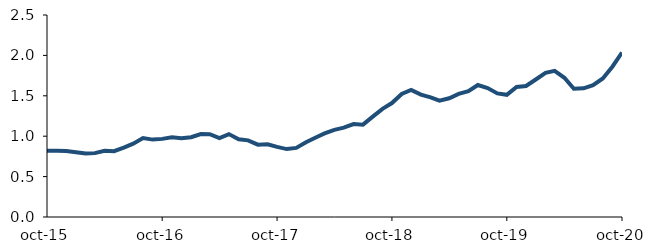
| Category | Series 0 |
|---|---|
| 2015-10-01 | 0.82 |
| 2015-11-01 | 0.821 |
| 2015-12-01 | 0.818 |
| 2016-01-01 | 0.803 |
| 2016-02-01 | 0.785 |
| 2016-03-01 | 0.79 |
| 2016-04-01 | 0.82 |
| 2016-05-01 | 0.815 |
| 2016-06-01 | 0.86 |
| 2016-07-01 | 0.907 |
| 2016-08-01 | 0.978 |
| 2016-09-01 | 0.958 |
| 2016-10-01 | 0.967 |
| 2016-11-01 | 0.986 |
| 2016-12-01 | 0.976 |
| 2017-01-01 | 0.988 |
| 2017-02-01 | 1.026 |
| 2017-03-01 | 1.025 |
| 2017-04-01 | 0.976 |
| 2017-05-01 | 1.026 |
| 2017-06-01 | 0.961 |
| 2017-07-01 | 0.948 |
| 2017-08-01 | 0.895 |
| 2017-09-01 | 0.9 |
| 2017-10-01 | 0.868 |
| 2017-11-01 | 0.84 |
| 2017-12-01 | 0.855 |
| 2018-01-01 | 0.925 |
| 2018-02-01 | 0.984 |
| 2018-03-01 | 1.034 |
| 2018-04-01 | 1.079 |
| 2018-05-01 | 1.105 |
| 2018-06-01 | 1.151 |
| 2018-07-01 | 1.143 |
| 2018-08-01 | 1.242 |
| 2018-09-01 | 1.338 |
| 2018-10-01 | 1.41 |
| 2018-11-01 | 1.523 |
| 2018-12-01 | 1.572 |
| 2019-01-01 | 1.514 |
| 2019-02-01 | 1.48 |
| 2019-03-01 | 1.44 |
| 2019-04-01 | 1.47 |
| 2019-05-01 | 1.523 |
| 2019-06-01 | 1.556 |
| 2019-07-01 | 1.634 |
| 2019-08-01 | 1.596 |
| 2019-09-01 | 1.53 |
| 2019-10-01 | 1.513 |
| 2019-11-01 | 1.61 |
| 2019-12-01 | 1.621 |
| 2020-01-01 | 1.702 |
| 2020-02-01 | 1.785 |
| 2020-03-01 | 1.809 |
| 2020-04-01 | 1.723 |
| 2020-05-01 | 1.587 |
| 2020-06-01 | 1.593 |
| 2020-07-01 | 1.632 |
| 2020-08-01 | 1.715 |
| 2020-09-01 | 1.863 |
| 2020-10-01 | 2.036 |